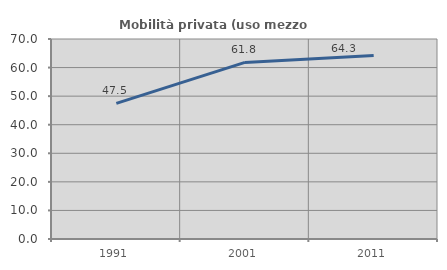
| Category | Mobilità privata (uso mezzo privato) |
|---|---|
| 1991.0 | 47.475 |
| 2001.0 | 61.809 |
| 2011.0 | 64.26 |